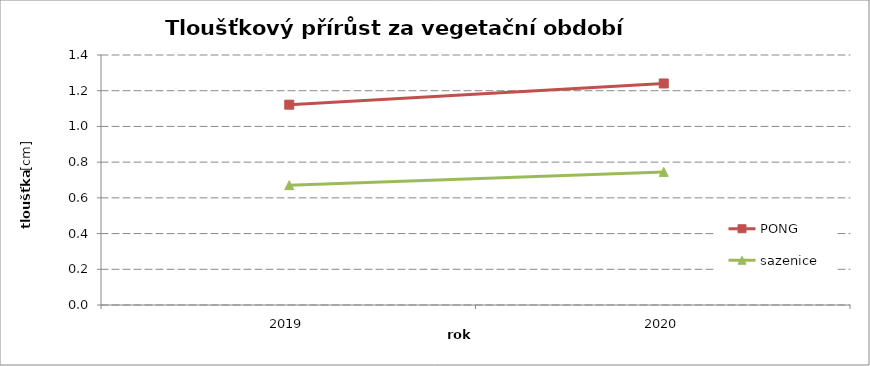
| Category | PONG | sazenice |
|---|---|---|
| 2019.0 | 1.122 | 0.671 |
| 2020.0 | 1.241 | 0.745 |